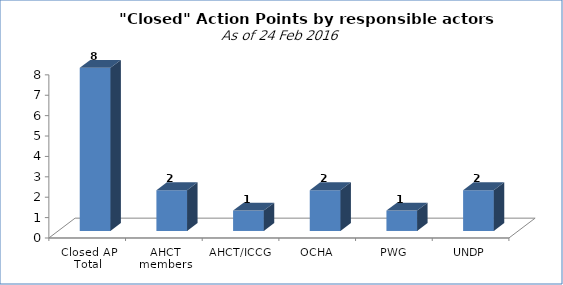
| Category | Count of Action |
|---|---|
| Closed AP Total | 8 |
| AHCT members | 2 |
| AHCT/ICCG | 1 |
| OCHA | 2 |
| PWG | 1 |
| UNDP | 2 |